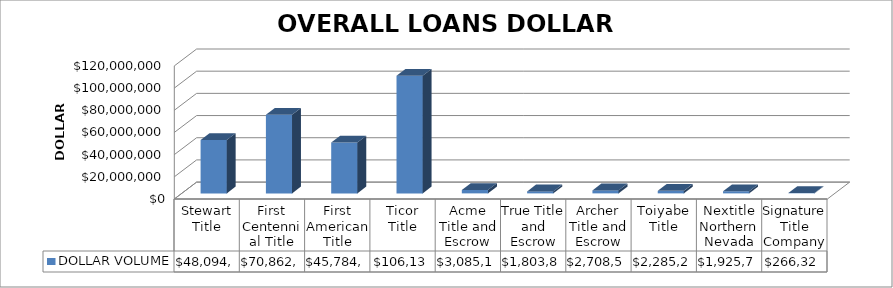
| Category | DOLLAR VOLUME |
|---|---|
| Stewart Title | 48094898 |
| First Centennial Title | 70862058 |
| First American Title | 45784441 |
| Ticor Title | 106137766 |
| Acme Title and Escrow | 3085140 |
| True Title and Escrow | 1803877 |
| Archer Title and Escrow | 2708500 |
| Toiyabe Title | 2285232 |
| Nextitle Northern Nevada | 1925755 |
| Signature Title Company | 266325 |